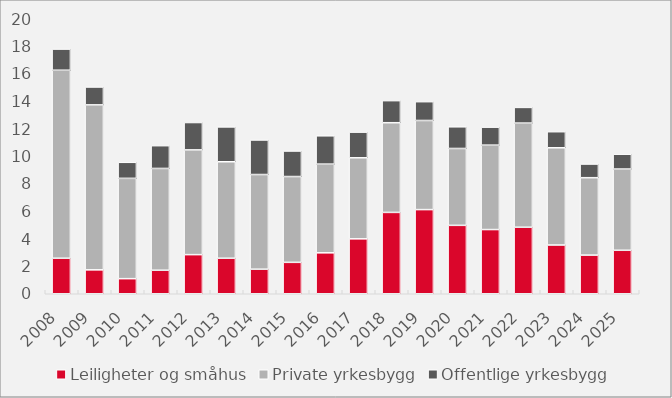
| Category | Leiligheter og småhus | Private yrkesbygg | Offentlige yrkesbygg |
|---|---|---|---|
| 2008.0 | 2.583 | 13.675 | 1.537 |
| 2009.0 | 1.739 | 11.998 | 1.299 |
| 2010.0 | 1.097 | 7.295 | 1.167 |
| 2011.0 | 1.711 | 7.402 | 1.657 |
| 2012.0 | 2.845 | 7.618 | 1.991 |
| 2013.0 | 2.583 | 7.017 | 2.534 |
| 2014.0 | 1.786 | 6.885 | 2.513 |
| 2015.0 | 2.285 | 6.24 | 1.857 |
| 2016.0 | 2.978 | 6.45 | 2.061 |
| 2017.0 | 3.994 | 5.894 | 1.867 |
| 2018.0 | 5.917 | 6.523 | 1.605 |
| 2019.0 | 6.12 | 6.481 | 1.369 |
| 2020.0 | 4.976 | 5.589 | 1.578 |
| 2021.0 | 4.669 | 6.14 | 1.309 |
| 2022.0 | 4.838 | 7.573 | 1.141 |
| 2023.0 | 3.546 | 7.07 | 1.169 |
| 2024.0 | 2.812 | 5.628 | 0.995 |
| 2025.0 | 3.162 | 5.908 | 1.08 |